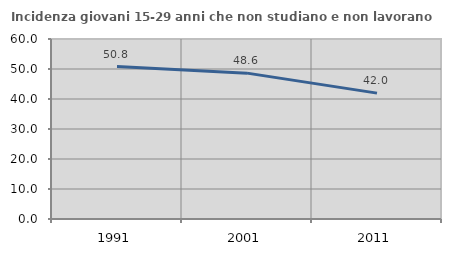
| Category | Incidenza giovani 15-29 anni che non studiano e non lavorano  |
|---|---|
| 1991.0 | 50.797 |
| 2001.0 | 48.619 |
| 2011.0 | 41.962 |